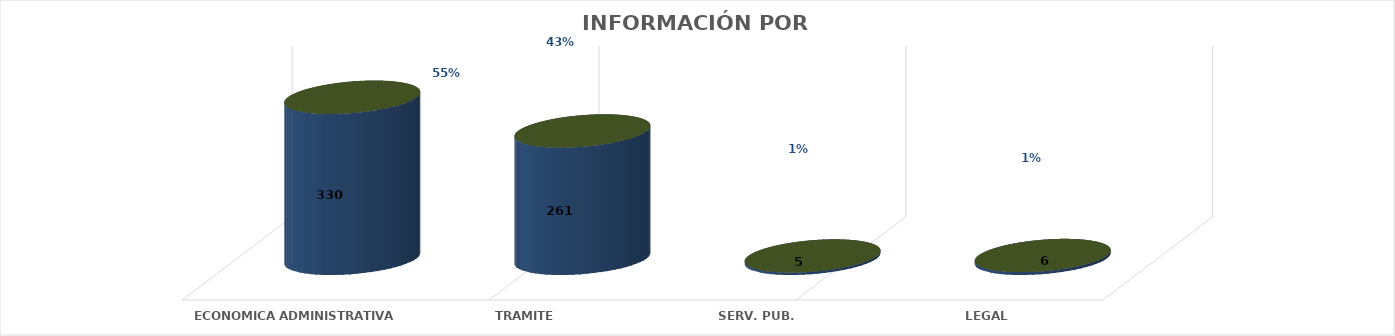
| Category | Series 0 | Series 1 | Series 2 | Series 3 | Series 4 |
|---|---|---|---|---|---|
| ECONOMICA ADMINISTRATIVA |  |  |  | 330 | 0.548 |
| TRAMITE |  |  |  | 261 | 0.434 |
| SERV. PUB. |  |  |  | 5 | 0.008 |
| LEGAL |  |  |  | 6 | 0.01 |